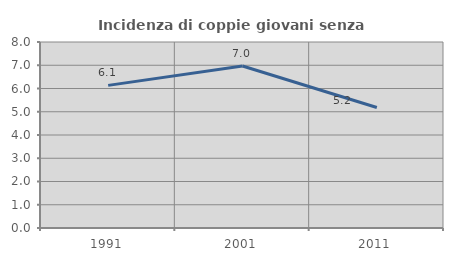
| Category | Incidenza di coppie giovani senza figli |
|---|---|
| 1991.0 | 6.135 |
| 2001.0 | 6.968 |
| 2011.0 | 5.184 |